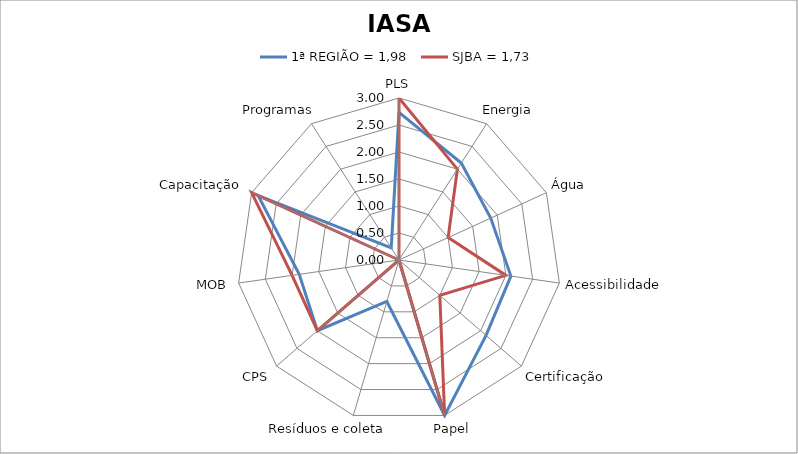
| Category | 1ª REGIÃO = 1,98 | SJBA = 1,73 |
|---|---|---|
| PLS | 2.733 | 3 |
| Energia | 2.133 | 2 |
| Água | 1.867 | 1 |
| Acessibilidade | 2.093 | 2 |
| Certificação | 2.133 | 1 |
| Papel | 3 | 3 |
| Resíduos e coleta | 0.8 | 0 |
| CPS | 2 | 2 |
| MOB | 1.867 | 2 |
| Capacitação | 2.867 | 3 |
| Programas | 0.267 | 0 |